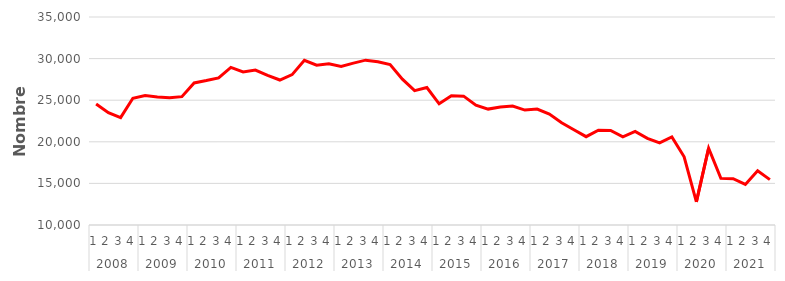
| Category | Série CVS-CJO * |
|---|---|
| 0 | 24552.376 |
| 1 | 23496.791 |
| 2 | 22903.132 |
| 3 | 25226.223 |
| 4 | 25560.155 |
| 5 | 25384.692 |
| 6 | 25288.102 |
| 7 | 25427.361 |
| 8 | 27072.652 |
| 9 | 27357.441 |
| 10 | 27679.514 |
| 11 | 28941.906 |
| 12 | 28392.824 |
| 13 | 28624.98 |
| 14 | 27994.279 |
| 15 | 27425.246 |
| 16 | 28074.933 |
| 17 | 29798.768 |
| 18 | 29200.318 |
| 19 | 29381.258 |
| 20 | 29066.389 |
| 21 | 29461.002 |
| 22 | 29813.582 |
| 23 | 29614.036 |
| 24 | 29279.321 |
| 25 | 27532.06 |
| 26 | 26141.589 |
| 27 | 26524.345 |
| 28 | 24564.286 |
| 29 | 25538.625 |
| 30 | 25486.172 |
| 31 | 24405.254 |
| 32 | 23932.168 |
| 33 | 24188.161 |
| 34 | 24290.359 |
| 35 | 23811.484 |
| 36 | 23935.802 |
| 37 | 23334.27 |
| 38 | 22298.358 |
| 39 | 21456.403 |
| 40 | 20616.32 |
| 41 | 21395.801 |
| 42 | 21372.832 |
| 43 | 20603.853 |
| 44 | 21238.44 |
| 45 | 20407.681 |
| 46 | 19863.531 |
| 47 | 20576.642 |
| 48 | 18195.194 |
| 49 | 12775.248 |
| 50 | 19235.624 |
| 51 | 15601.761 |
| 52 | 15559.365 |
| 53 | 14871.371 |
| 54 | 16519.615 |
| 55 | 15450.93 |